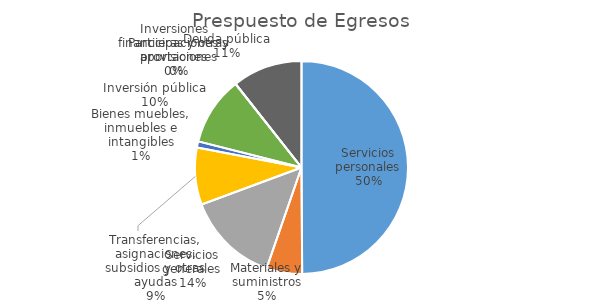
| Category | Series 0 |
|---|---|
| Servicios personales | 264172326.648 |
| Materiales y suministros | 28611223 |
| Servicios generales | 74369997 |
| Transferencias, asignaciones, subsidios y otras ayudas | 45801011 |
| Bienes muebles, inmuebles e intangibles | 4974432 |
| Inversión pública | 55209868 |
| Inversiones financieras y otras provisiones | 0 |
| Participaciones y aportaciones | 0 |
| Deuda pública | 56269029 |